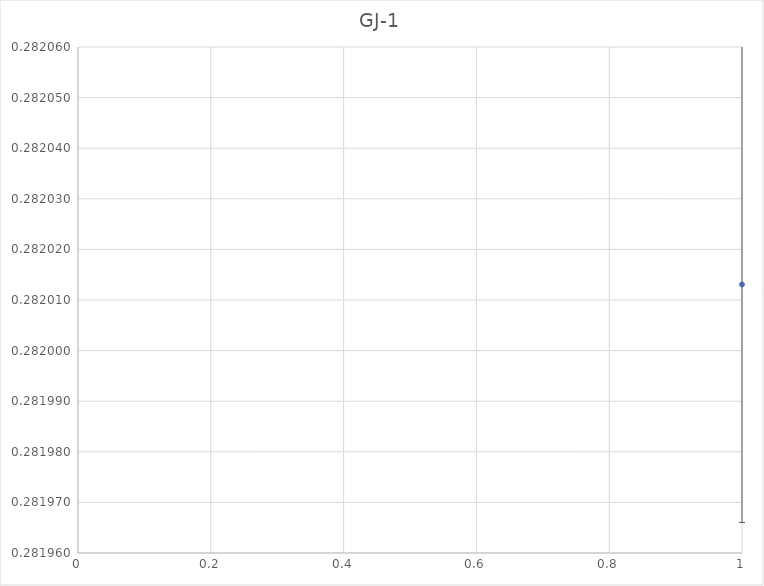
| Category | Series 0 |
|---|---|
| 0 | 0.282 |
| 1 | 0.282 |
| 2 | 0.282 |
| 3 | 0.282 |
| 4 | 0.282 |
| 5 | 0.282 |
| 6 | 0.282 |
| 7 | 0.282 |
| 8 | 0.282 |
| 9 | 0.282 |
| 10 | 0.282 |
| 11 | 0.282 |
| 12 | 0.282 |
| 13 | 0.282 |
| 14 | 0.282 |
| 15 | 0.282 |
| 16 | 0.282 |